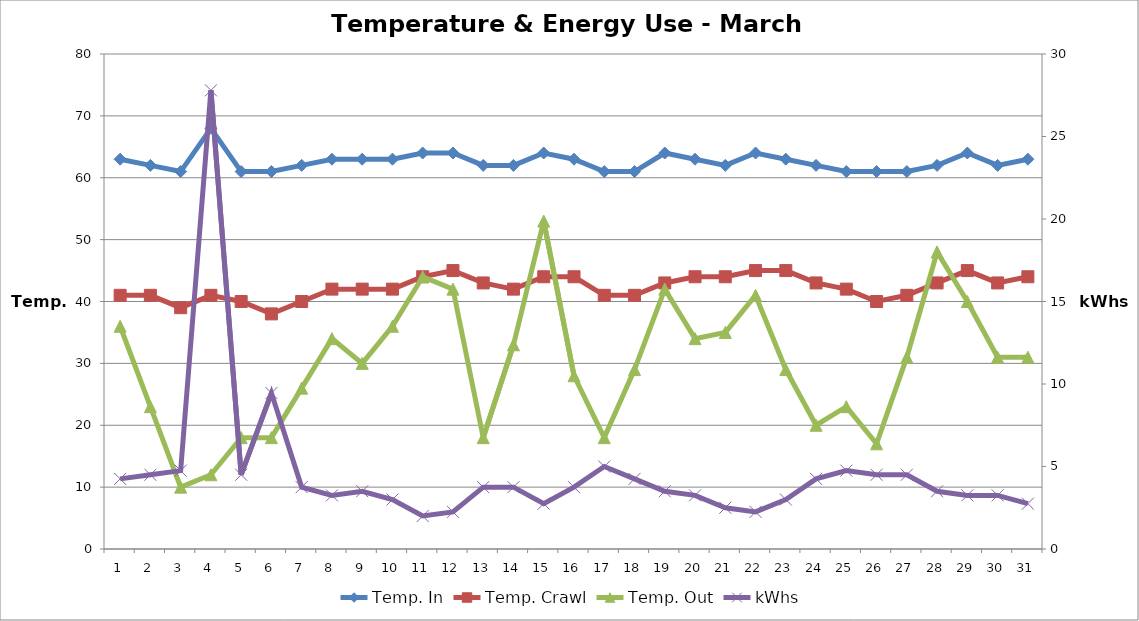
| Category | Temp. In | Temp. Crawl | Temp. Out |
|---|---|---|---|
| 0 | 63 | 41 | 36 |
| 1 | 62 | 41 | 23 |
| 2 | 61 | 39 | 10 |
| 3 | 68 | 41 | 12 |
| 4 | 61 | 40 | 18 |
| 5 | 61 | 38 | 18 |
| 6 | 62 | 40 | 26 |
| 7 | 63 | 42 | 34 |
| 8 | 63 | 42 | 30 |
| 9 | 63 | 42 | 36 |
| 10 | 64 | 44 | 44 |
| 11 | 64 | 45 | 42 |
| 12 | 62 | 43 | 18 |
| 13 | 62 | 42 | 33 |
| 14 | 64 | 44 | 53 |
| 15 | 63 | 44 | 28 |
| 16 | 61 | 41 | 18 |
| 17 | 61 | 41 | 29 |
| 18 | 64 | 43 | 42 |
| 19 | 63 | 44 | 34 |
| 20 | 62 | 44 | 35 |
| 21 | 64 | 45 | 41 |
| 22 | 63 | 45 | 29 |
| 23 | 62 | 43 | 20 |
| 24 | 61 | 42 | 23 |
| 25 | 61 | 40 | 17 |
| 26 | 61 | 41 | 31 |
| 27 | 62 | 43 | 48 |
| 28 | 64 | 45 | 40 |
| 29 | 62 | 43 | 31 |
| 30 | 63 | 44 | 31 |